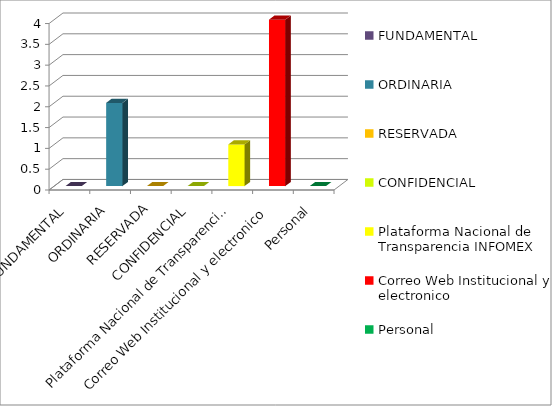
| Category | Series 2 |
|---|---|
| FUNDAMENTAL | 0 |
| ORDINARIA | 2 |
| RESERVADA | 0 |
| CONFIDENCIAL | 0 |
| Plataforma Nacional de Transparencia INFOMEX | 1 |
| Correo Web Institucional y electronico | 4 |
| Personal | 0 |